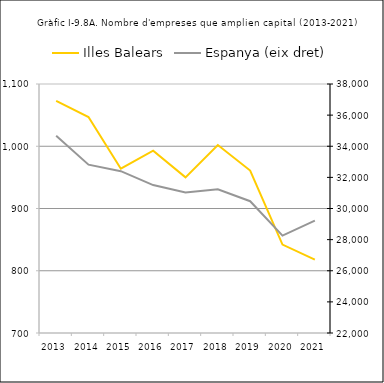
| Category | Illes Balears |
|---|---|
| 2013.0 | 1073 |
| 2014.0 | 1047 |
| 2015.0 | 964 |
| 2016.0 | 993 |
| 2017.0 | 950 |
| 2018.0 | 1002 |
| 2019.0 | 961 |
| 2020.0 | 842 |
| 2021.0 | 818 |